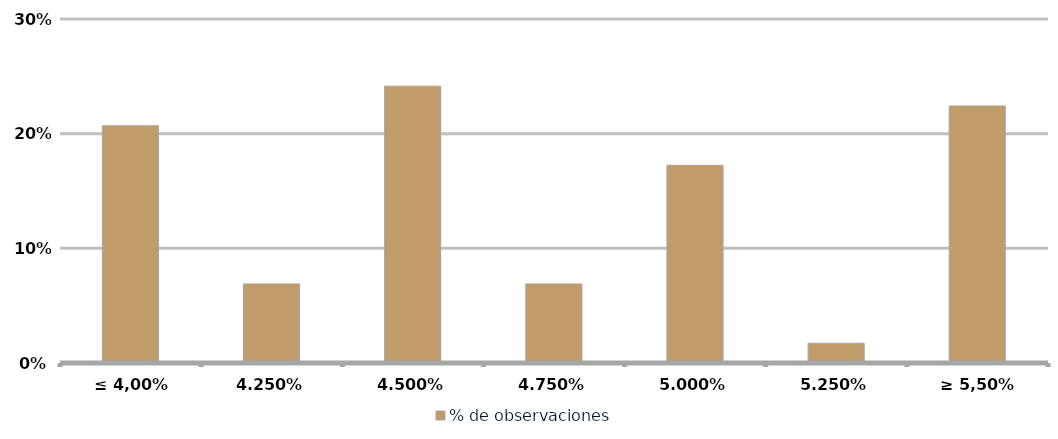
| Category | % de observaciones  |
|---|---|
| ≤ 4,00% | 0.207 |
| 4,25% | 0.069 |
| 4,50% | 0.241 |
| 4,75% | 0.069 |
| 5,00% | 0.172 |
| 5,25% | 0.017 |
| ≥ 5,50% | 0.224 |